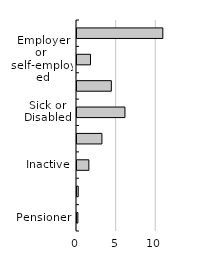
| Category | Taxes + contributions | Benefits |
|---|---|---|
| Pensioner | 0 | 0.237 |
| Employee | 0 | 0.28 |
| Inactive | 0 | 1.621 |
| Other | 0 | 3.271 |
| Sick or Disabled | 0 | 6.173 |
| Student | 0 | 4.456 |
| Employer or 
self-employed | 0 | 1.832 |
| Unemployed | 0 | 10.951 |